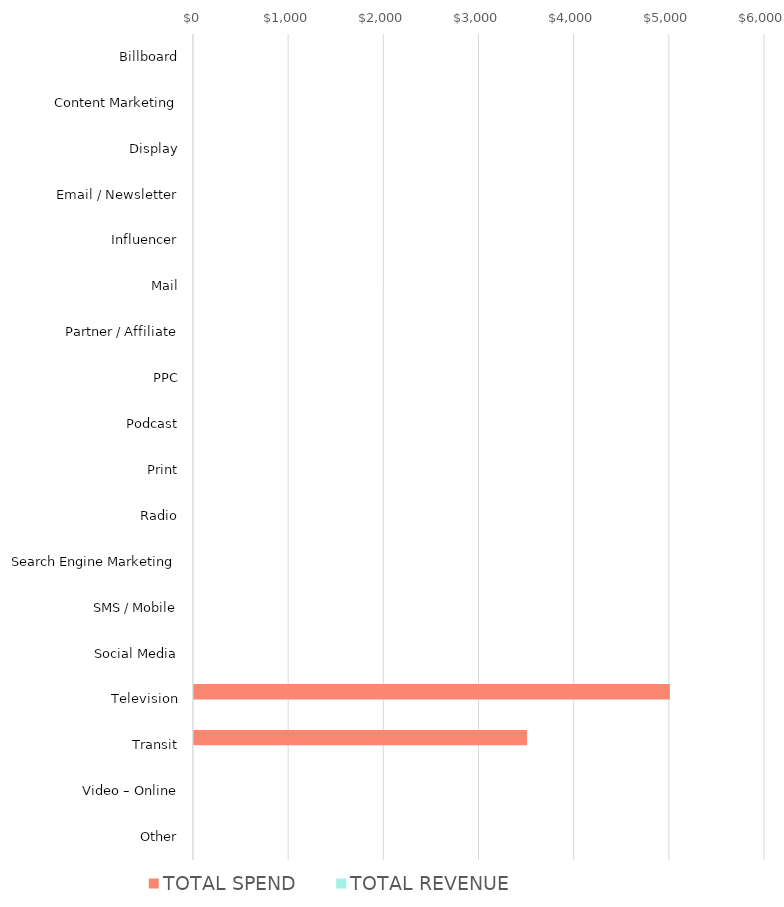
| Category | TOTAL SPEND | TOTAL REVENUE |
|---|---|---|
| Billboard | 0 | 0 |
| Content Marketing | 0 | 0 |
| Display | 0 | 0 |
| Email / Newsletter | 0 | 0 |
| Influencer | 0 | 0 |
| Mail | 0 | 0 |
| Partner / Affiliate | 0 | 0 |
| PPC | 0 | 0 |
| Podcast | 0 | 0 |
| Print | 0 | 0 |
| Radio | 0 | 0 |
| Search Engine Marketing | 0 | 0 |
| SMS / Mobile | 0 | 0 |
| Social Media | 0 | 0 |
| Television | 5000 | 0 |
| Transit | 3500 | 0 |
| Video – Online | 0 | 0 |
| Other | 0 | 0 |